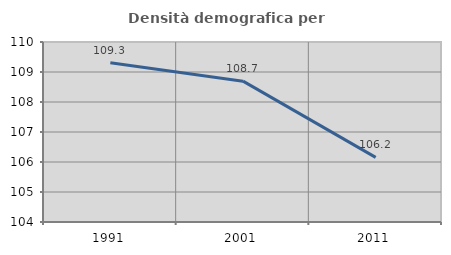
| Category | Densità demografica |
|---|---|
| 1991.0 | 109.309 |
| 2001.0 | 108.695 |
| 2011.0 | 106.153 |